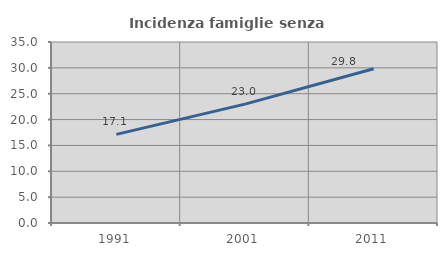
| Category | Incidenza famiglie senza nuclei |
|---|---|
| 1991.0 | 17.143 |
| 2001.0 | 22.984 |
| 2011.0 | 29.814 |